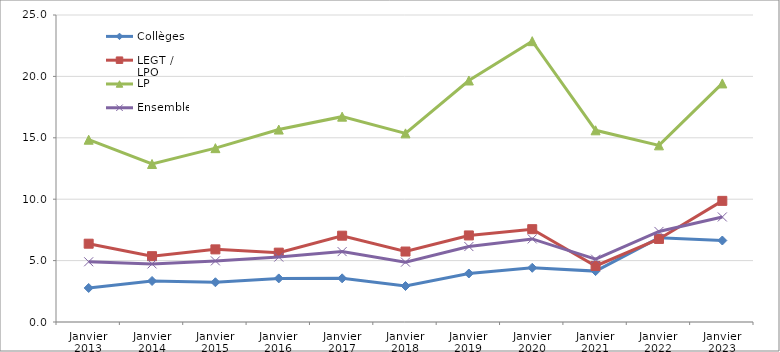
| Category | Collèges | LEGT / LPO | LP | Ensemble |
|---|---|---|---|---|
| Janvier 2013 | 2.772 | 6.376 | 14.844 | 4.904 |
| Janvier 2014 | 3.341 | 5.36 | 12.869 | 4.73 |
| Janvier 2015 | 3.237 | 5.915 | 14.156 | 4.976 |
| Janvier 2016 | 3.55 | 5.648 | 15.671 | 5.285 |
| Janvier 2017 | 3.556 | 7.029 | 16.721 | 5.731 |
| Janvier 2018 | 2.931 | 5.737 | 15.362 | 4.873 |
| Janvier 2019 | 3.95 | 7.05 | 19.665 | 6.145 |
| Janvier 2020 | 4.414 | 7.559 | 22.869 | 6.766 |
| Janvier 2021 | 4.144 | 4.563 | 15.611 | 5.115 |
| Janvier 2022 | 6.852 | 6.764 | 14.385 | 7.374 |
| Janvier 2023 | 6.636 | 9.864 | 19.428 | 8.553 |